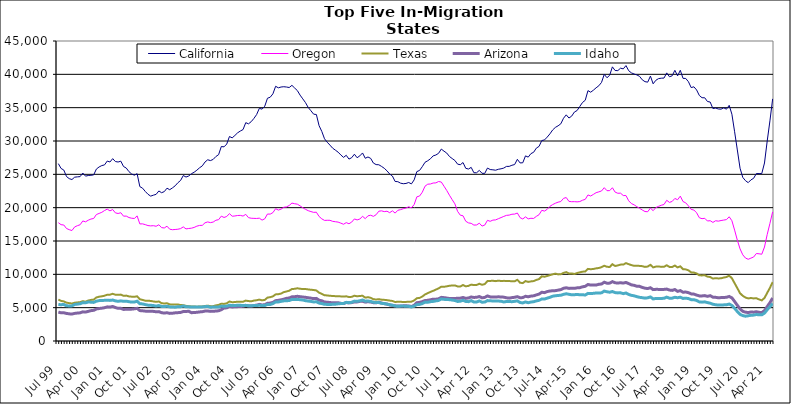
| Category | California | Oregon | Texas | Arizona | Idaho |
|---|---|---|---|---|---|
| Jul 99 | 26605 | 17749 | 6209 | 4339 | 5471 |
| Aug 99 | 25882 | 17447 | 6022 | 4228 | 5444 |
| Sep 99 | 25644 | 17401 | 5941 | 4237 | 5488 |
| Oct 99 | 24669 | 16875 | 5751 | 4134 | 5279 |
| Nov 99 | 24353 | 16701 | 5680 | 4073 | 5260 |
| Dec 99 | 24218 | 16570 | 5619 | 4042 | 5269 |
| Jan 00 | 24574 | 17109 | 5736 | 4142 | 5485 |
| Feb 00 | 24620 | 17295 | 5789 | 4192 | 5530 |
| Mar 00 | 24655 | 17436 | 5826 | 4226 | 5590 |
| Apr 00 | 25195 | 18009 | 5980 | 4375 | 5748 |
| May 00 | 24730 | 17875 | 5897 | 4337 | 5729 |
| Jun 00 | 24825 | 18113 | 6070 | 4444 | 5853 |
| Jul 00 | 24857 | 18294 | 6163 | 4555 | 5824 |
| Aug 00 | 24913 | 18376 | 6199 | 4603 | 5788 |
| Sep 00 | 25792 | 18971 | 6529 | 4804 | 5976 |
| Oct 00 | 26106 | 19135 | 6643 | 4870 | 6058 |
| Nov 00 | 26315 | 19306 | 6705 | 4926 | 6085 |
| Dec 00 | 26415 | 19570 | 6793 | 4991 | 6096 |
| Jan 01 | 26995 | 19781 | 6942 | 5122 | 6119 |
| Feb 01 | 26851 | 19519 | 6948 | 5089 | 6090 |
| Mar 01 | 27352 | 19720 | 7080 | 5180 | 6143 |
| Apr 01 | 26918 | 19221 | 6943 | 5020 | 6020 |
| May 01 | 26848 | 19126 | 6924 | 4899 | 5950 |
| Jun 01 | 26974 | 19241 | 6959 | 4895 | 6019 |
| Jul 01 | 26172 | 18725 | 6778 | 4737 | 5951 |
| Aug 01 | 25943 | 18736 | 6810 | 4757 | 5973 |
| Sep 01 | 25399 | 18514 | 6688 | 4753 | 5895 |
| Oct 01 | 25050 | 18415 | 6650 | 4780 | 5833 |
| Nov 01 | 24873 | 18381 | 6631 | 4826 | 5850 |
| Dec 01 | 25099 | 18765 | 6708 | 4898 | 5969 |
| Jan 02 | 23158 | 17561 | 6261 | 4560 | 5595 |
| Feb 02 | 22926 | 17573 | 6162 | 4531 | 5560 |
| Mar 02 | 22433 | 17452 | 6052 | 4481 | 5458 |
| Apr 02 | 22012 | 17314 | 6046 | 4458 | 5380 |
| May 02 | 21733 | 17267 | 6007 | 4452 | 5358 |
| Jun 02 | 21876 | 17298 | 5933 | 4444 | 5315 |
| Jul 02 | 21997 | 17209 | 5873 | 4383 | 5243 |
| Aug 02 | 22507 | 17436 | 5929 | 4407 | 5315 |
| Sep 02 | 22244 | 17010 | 5672 | 4248 | 5192 |
| Oct 02 | 22406 | 16952 | 5625 | 4191 | 5167 |
| Nov 02 | 22922 | 17223 | 5663 | 4242 | 5221 |
| Dec 02 | 22693 | 16770 | 5499 | 4142 | 5120 |
| Jan 03 | 22964 | 16694 | 5463 | 4166 | 5089 |
| Feb 03 | 23276 | 16727 | 5461 | 4226 | 5077 |
| Mar 03 | 23736 | 16766 | 5486 | 4251 | 5145 |
| Apr 03 | 24079 | 16859 | 5389 | 4289 | 5145 |
| May 03 | 24821 | 17117 | 5378 | 4415 | 5254 |
| Jun 03 | 24592 | 16812 | 5273 | 4426 | 5135 |
| Jul 03 | 24754 | 16875 | 5226 | 4466 | 5124 |
| Aug 03 | 25092 | 16922 | 5181 | 4244 | 5100 |
| Sep 03 | 25316 | 17036 | 5181 | 4279 | 5086 |
| Oct 03 | 25622 | 17228 | 5139 | 4301 | 5110 |
| Nov 03 | 25984 | 17335 | 5175 | 4362 | 5091 |
| Dec 03 | 26269 | 17350 | 5189 | 4396 | 5113 |
| Jan 04 | 26852 | 17734 | 5255 | 4492 | 5152 |
| Feb 04 | 27184 | 17860 | 5301 | 4502 | 5183 |
| Mar 04 | 27062 | 17757 | 5227 | 4443 | 5056 |
| Apr 04 | 27238 | 17840 | 5227 | 4461 | 5104 |
| May 04 | 27671 | 18113 | 5345 | 4493 | 5095 |
| Jun 04 | 27949 | 18201 | 5416 | 4532 | 5103 |
| Jul 04 | 29172 | 18727 | 5597 | 4697 | 5231 |
| Aug 04 | 29122 | 18529 | 5561 | 4945 | 5197 |
| Sep 04 | 29542 | 18678 | 5656 | 4976 | 5237 |
| Oct 04 | 30674 | 19108 | 5922 | 5188 | 5363 |
| Nov 04 | 30472 | 18716 | 5823 | 5106 | 5321 |
| Dec 04 | 30831 | 18755 | 5838 | 5135 | 5312 |
| Jan 05 | 31224 | 18823 | 5906 | 5155 | 5374 |
| Feb 05 | 31495 | 18842 | 5898 | 5168 | 5357 |
| Mar 05 | 31714 | 18738 | 5894 | 5212 | 5313 |
| Apr 05 | 32750 | 18998 | 6060 | 5340 | 5350 |
| May 05 | 32575 | 18504 | 5989 | 5269 | 5276 |
| Jun 05 | 32898 | 18414 | 5954 | 5252 | 5271 |
| Jul 05 | 33384 | 18395 | 6062 | 5322 | 5322 |
| Aug 05 | 33964 | 18381 | 6113 | 5375 | 5316 |
| Sep 05 | 34897 | 18426 | 6206 | 5493 | 5362 |
| Oct 05 | 34780 | 18132 | 6100 | 5408 | 5308 |
| Nov 05 | 35223 | 18332 | 6162 | 5434 | 5314 |
| Dec 05 | 36415 | 19047 | 6508 | 5658 | 5487 |
| Jan 06 | 36567 | 19032 | 6576 | 5688 | 5480 |
| Feb 06 | 37074 | 19257 | 6692 | 5792 | 5616 |
| Mar 06 | 38207 | 19845 | 6993 | 6052 | 5850 |
| Apr 06 | 37976 | 19637 | 7024 | 6101 | 5864 |
| May 06 | 38099 | 19781 | 7114 | 6178 | 5943 |
| Jun 06 | 38141 | 20061 | 7331 | 6276 | 6018 |
| Jul 06 | 38097 | 20111 | 7431 | 6399 | 6046 |
| Aug 06 | 38021 | 20333 | 7542 | 6450 | 6064 |
| Sep 06 | 38349 | 20686 | 7798 | 6627 | 6232 |
| Oct 06 | 37947 | 20591 | 7825 | 6647 | 6216 |
| Nov 06 | 37565 | 20526 | 7907 | 6707 | 6244 |
| Dec 06 | 36884 | 20272 | 7840 | 6648 | 6192 |
| Jan 07 | 36321 | 19984 | 7789 | 6597 | 6151 |
| Feb 07 | 35752 | 19752 | 7799 | 6554 | 6048 |
| Mar 07 | 35025 | 19547 | 7737 | 6487 | 5989 |
| Apr 07 | 34534 | 19412 | 7685 | 6430 | 5937 |
| May 07 | 34022 | 19296 | 7654 | 6353 | 5858 |
| Jun 07 | 33974 | 19318 | 7577 | 6390 | 5886 |
| Jul 07 | 32298 | 18677 | 7250 | 6117 | 5682 |
| Aug 07 | 31436 | 18322 | 7070 | 6034 | 5617 |
| Sep 07 | 30331 | 18087 | 6853 | 5847 | 5500 |
| Oct 07 | 29813 | 18108 | 6839 | 5821 | 5489 |
| Nov 07 | 29384 | 18105 | 6777 | 5769 | 5481 |
| Dec 07 | 28923 | 17949 | 6760 | 5733 | 5499 |
| Jan 08 | 28627 | 17890 | 6721 | 5732 | 5521 |
| Feb 08 | 28328 | 17834 | 6719 | 5749 | 5579 |
| Mar 08 | 27911 | 17680 | 6690 | 5650 | 5614 |
| Apr 08 | 27543 | 17512 | 6656 | 5612 | 5635 |
| May 08 | 27856 | 17754 | 6705 | 5774 | 5798 |
| Jun 08 | 27287 | 17589 | 6593 | 5717 | 5745 |
| Jul 08 | 27495 | 17834 | 6623 | 5761 | 5807 |
| Aug 08 | 28018 | 18309 | 6789 | 5867 | 5982 |
| Sep-08 | 27491 | 18164 | 6708 | 5864 | 5954 |
| Oct 08 | 27771 | 18291 | 6755 | 5942 | 6032 |
| Nov 08 | 28206 | 18706 | 6787 | 5970 | 6150 |
| Dec 08 | 27408 | 18353 | 6505 | 5832 | 5975 |
| Jan 09 | 27601 | 18778 | 6569 | 5890 | 5995 |
| Feb 09 | 27394 | 18863 | 6483 | 5845 | 5936 |
| Mar 09 | 26690 | 18694 | 6273 | 5751 | 5806 |
| Apr 09 | 26461 | 18943 | 6222 | 5735 | 5777 |
| May 09 | 26435 | 19470 | 6272 | 5819 | 5767 |
| Jun 09 | 26187 | 19522 | 6199 | 5700 | 5649 |
| Jul 09 | 25906 | 19408 | 6171 | 5603 | 5617 |
| Aug 09 | 25525 | 19469 | 6128 | 5533 | 5540 |
| Sep 09 | 25050 | 19249 | 6059 | 5405 | 5437 |
| Oct 09 | 24741 | 19529 | 6004 | 5349 | 5369 |
| Nov 09 | 23928 | 19187 | 5854 | 5271 | 5248 |
| Dec 09 | 23899 | 19607 | 5886 | 5261 | 5195 |
| Jan 10 | 23676 | 19703 | 5881 | 5232 | 5234 |
| Feb 10 | 23592 | 19845 | 5850 | 5272 | 5236 |
| Mar 10 | 23634 | 19946 | 5864 | 5278 | 5219 |
| Apr 10 | 23774 | 20134 | 5889 | 5257 | 5201 |
| May 10 | 23567 | 19966 | 5897 | 5172 | 5105 |
| Jun 10 | 24166 | 20464 | 6087 | 5356 | 5237 |
| Jul 10 | 25410 | 21627 | 6417 | 5742 | 5452 |
| Aug 10 | 25586 | 21744 | 6465 | 5797 | 5491 |
| Sep 10 | 26150 | 22314 | 6667 | 5907 | 5609 |
| Oct 10 | 26807 | 23219 | 6986 | 6070 | 5831 |
| Nov 10 | 27033 | 23520 | 7179 | 6100 | 5810 |
| Dec 10 | 27332 | 23551 | 7361 | 6182 | 5898 |
| Jan 11 | 27769 | 23697 | 7525 | 6276 | 5938 |
| Feb 11 | 27898 | 23718 | 7708 | 6267 | 6016 |
| Mar 11 | 28155 | 23921 | 7890 | 6330 | 6081 |
| Apr 11 | 28790 | 23847 | 8146 | 6544 | 6305 |
| May 11 | 28471 | 23215 | 8131 | 6502 | 6248 |
| Jun 11 | 28191 | 22580 | 8199 | 6445 | 6217 |
| Jul 11 | 27678 | 21867 | 8291 | 6368 | 6202 |
| Aug 11 | 27372 | 21203 | 8321 | 6356 | 6146 |
| Sep 11 | 27082 | 20570 | 8341 | 6387 | 6075 |
| Oct 11 | 26528 | 19442 | 8191 | 6402 | 5932 |
| Nov 11 | 26440 | 18872 | 8176 | 6426 | 5968 |
| Dec 11 | 26770 | 18784 | 8401 | 6533 | 6106 |
| Jan 12 | 25901 | 17963 | 8202 | 6390 | 5933 |
| Feb 12 | 25796 | 17718 | 8266 | 6456 | 5900 |
| Mar 12 | 26042 | 17647 | 8456 | 6600 | 6054 |
| Apr 12 | 25239 | 17386 | 8388 | 6534 | 5838 |
| May 12 | 25238 | 17407 | 8401 | 6558 | 5854 |
| Jun 12 | 25593 | 17673 | 8594 | 6669 | 6009 |
| Jul 12 | 25155 | 17237 | 8432 | 6474 | 5817 |
| Aug 12 | 25146 | 17391 | 8536 | 6539 | 5842 |
| Sep 12 | 25942 | 18102 | 8989 | 6759 | 6061 |
| Oct 12 | 25718 | 17953 | 9012 | 6618 | 6027 |
| Nov 12 | 25677 | 18134 | 9032 | 6611 | 6009 |
| Dec 12 | 25619 | 18166 | 8981 | 6601 | 5999 |
| Jan 13 | 25757 | 18344 | 9051 | 6627 | 5989 |
| Feb-13 | 25830 | 18512 | 9001 | 6606 | 5968 |
| Mar-13 | 25940 | 18689 | 9021 | 6577 | 5853 |
| Apr 13 | 26187 | 18844 | 9013 | 6478 | 5925 |
| May 13 | 26192 | 18884 | 9003 | 6431 | 5924 |
| Jun-13 | 26362 | 19013 | 8948 | 6508 | 5896 |
| Jul 13 | 26467 | 19037 | 8958 | 6559 | 5948 |
| Aug 13 | 27253 | 19198 | 9174 | 6655 | 6020 |
| Sep 13 | 26711 | 18501 | 8747 | 6489 | 5775 |
| Oct 13 | 26733 | 18301 | 8681 | 6511 | 5711 |
| Nov 13 | 27767 | 18620 | 8989 | 6709 | 5860 |
| Dec 13 | 27583 | 18320 | 8863 | 6637 | 5740 |
| Jan 14 | 28107 | 18409 | 8939 | 6735 | 5843 |
| Feb-14 | 28313 | 18383 | 8989 | 6779 | 5893 |
| Mar 14 | 28934 | 18696 | 9160 | 6918 | 6015 |
| Apr 14 | 29192 | 18946 | 9291 | 7036 | 6099 |
| May 14 | 30069 | 19603 | 9701 | 7314 | 6304 |
| Jun 14 | 30163 | 19487 | 9641 | 7252 | 6293 |
| Jul-14 | 30587 | 19754 | 9752 | 7415 | 6427 |
| Aug-14 | 31074 | 20201 | 9882 | 7499 | 6557 |
| Sep 14 | 31656 | 20459 | 9997 | 7536 | 6719 |
| Oct 14 | 32037 | 20663 | 10109 | 7555 | 6786 |
| Nov 14 | 32278 | 20825 | 9992 | 7628 | 6831 |
| Dec 14 | 32578 | 20918 | 10006 | 7705 | 6860 |
| Jan 15 | 33414 | 21396 | 10213 | 7906 | 7000 |
| Feb 15 | 33922 | 21518 | 10337 | 7982 | 7083 |
| Mar 15 | 33447 | 20942 | 10122 | 7891 | 7006 |
| Apr-15 | 33731 | 20893 | 10138 | 7906 | 6931 |
| May 15 | 34343 | 20902 | 10053 | 7895 | 6952 |
| Jun-15 | 34572 | 20870 | 10192 | 7973 | 6966 |
| Jul 15 | 35185 | 20916 | 10303 | 8000 | 6949 |
| Aug 15 | 35780 | 21115 | 10399 | 8126 | 6938 |
| Sep 15 | 36109 | 21246 | 10428 | 8207 | 6896 |
| Oct 15 | 37555 | 21908 | 10813 | 8477 | 7140 |
| Nov 15 | 37319 | 21750 | 10763 | 8390 | 7112 |
| Dec 15 | 37624 | 21990 | 10807 | 8395 | 7149 |
| Jan 16 | 37978 | 22248 | 10892 | 8388 | 7201 |
| Feb 16 | 38285 | 22369 | 10951 | 8508 | 7192 |
| Mar 16 | 38792 | 22506 | 11075 | 8547 | 7226 |
| Apr 16 | 39994 | 22999 | 11286 | 8815 | 7487 |
| May 16 | 39488 | 22548 | 11132 | 8673 | 7382 |
| Jun 16 | 39864 | 22556 | 11100 | 8682 | 7315 |
| Jul 16 | 41123 | 22989 | 11516 | 8903 | 7420 |
| Aug 16 | 40573 | 22333 | 11251 | 8731 | 7261 |
| Sep 16 | 40560 | 22162 | 11340 | 8692 | 7216 |
| Oct 16 | 40923 | 22172 | 11456 | 8742 | 7233 |
| Nov 16 | 40817 | 21818 | 11459 | 8685 | 7101 |
| Dec 16 | 41311 | 21815 | 11681 | 8783 | 7203 |
| Jan 17 | 40543 | 21029 | 11524 | 8609 | 6982 |
| Feb 17 | 40218 | 20613 | 11385 | 8416 | 6852 |
| Mar 17 | 40052 | 20425 | 11276 | 8354 | 6775 |
| Apr 17 | 39913 | 20147 | 11297 | 8218 | 6653 |
| May 17 | 39695 | 19910 | 11265 | 8196 | 6552 |
| Jun 17 | 39177 | 19650 | 11225 | 8034 | 6500 |
| Jul 17 | 38901 | 19419 | 11115 | 7923 | 6429 |
| Aug 17 | 38827 | 19389 | 11168 | 7867 | 6479 |
| Sep 17 | 39736 | 19936 | 11426 | 7991 | 6609 |
| Oct 17 | 38576 | 19547 | 11041 | 7708 | 6315 |
| Nov 17 | 39108 | 20013 | 11158 | 7746 | 6381 |
| Dec 17 | 39359 | 20202 | 11185 | 7743 | 6366 |
| Jan 18 | 39420 | 20362 | 11118 | 7736 | 6380 |
| Feb 18 | 39440 | 20476 | 11128 | 7741 | 6407 |
| Mar 18 | 40218 | 21106 | 11362 | 7789 | 6578 |
| Apr 18 | 39637 | 20788 | 11111 | 7642 | 6423 |
| May 18 | 39777 | 20933 | 11097 | 7591 | 6430 |
| Jun 18 | 40602 | 21381 | 11317 | 7721 | 6554 |
| Jul 18 | 39767 | 21189 | 11038 | 7445 | 6489 |
| Aug 18 | 40608 | 21729 | 11200 | 7560 | 6569 |
| Sep 18 | 39395 | 20916 | 10772 | 7318 | 6383 |
| Oct 18 | 39383 | 20724 | 10740 | 7344 | 6429 |
| Nov 18 | 38891 | 20265 | 10605 | 7255 | 6365 |
| Dec 18 | 38013 | 19741 | 10292 | 7069 | 6205 |
| Jan 19 | 38130 | 19643 | 10261 | 7032 | 6203 |
| Feb 19 | 37658 | 19237 | 10132 | 6892 | 6073 |
| Mar 19 | 36831 | 18492 | 9848 | 6766 | 5863 |
| Apr 19 | 36492 | 18349 | 9839 | 6763 | 5827 |
| May 19 | 36481 | 18407 | 9867 | 6809 | 5873 |
| Jun 19 | 35925 | 17998 | 9661 | 6698 | 5761 |
| Jul 19 | 35843 | 18049 | 9598 | 6800 | 5673 |
| Aug 19 | 34870 | 17785 | 9361 | 6577 | 5512 |
| Sep 19 | 34945 | 18038 | 9428 | 6547 | 5437 |
| Oct 19 | 34802 | 17977 | 9385 | 6483 | 5390 |
| Nov 19 | 34775 | 18072 | 9403 | 6511 | 5401 |
| Dec 19 | 34976 | 18140 | 9518 | 6521 | 5419 |
| Jan 20 | 34774 | 18209 | 9594 | 6561 | 5434 |
| Feb 20 | 35352 | 18632 | 9804 | 6682 | 5543 |
| Mar 20 | 34013 | 18041 | 9411 | 6464 | 5330 |
| Apr 20 | 31385 | 16629 | 8666 | 5922 | 4906 |
| May 20 | 28657 | 15123 | 7927 | 5355 | 4419 |
| Jun 20 | 25915 | 13817 | 7164 | 4815 | 3992 |
| Jul 20 | 24545 | 12926 | 6776 | 4457 | 3810 |
| Aug 20 | 24048 | 12443 | 6521 | 4326 | 3720 |
| Sep 20 | 23756 | 12258 | 6386 | 4266 | 3784 |
| Oct 20 | 24166 | 12429 | 6452 | 4347 | 3861 |
| Nov 20 | 24404 | 12597 | 6386 | 4324 | 3883 |
| Dec 20 | 25120 | 13122 | 6420 | 4394 | 3974 |
| Jan 21 | 25111 | 13080 | 6236 | 4304 | 3924 |
| Feb 21 | 25114 | 13015 | 6094 | 4260 | 3930 |
| Mar 21 | 26701 | 14096 | 6455 | 4567 | 4185 |
| Apr 21 | 29998 | 15978 | 7222 | 5164 | 4697 |
| May 21 | 33020 | 17641 | 7969 | 5748 | 5148 |
| Jun 21 | 36320 | 19369 | 8840 | 6450 | 5628 |